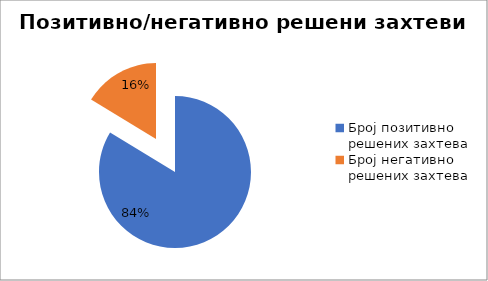
| Category | Series 0 |
|---|---|
| Број позитивно решених захтева | 79171 |
| Број негативно решених захтева | 15422 |